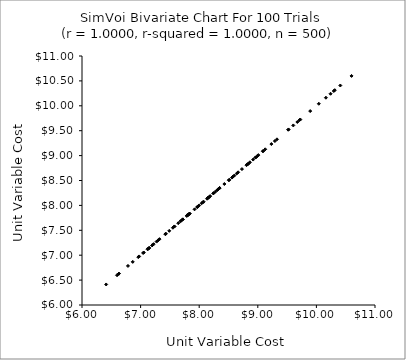
| Category | Series 0 |
|---|---|
| 8.5799233662857 | 8.58 |
| 8.322798937939595 | 8.323 |
| 7.201467640726995 | 7.201 |
| 7.811482448741565 | 7.811 |
| 9.126457782483506 | 9.126 |
| 6.412461766414863 | 6.412 |
| 7.719423426696527 | 7.719 |
| 8.558672436460132 | 8.559 |
| 7.718661596310512 | 7.719 |
| 8.134011712817045 | 8.134 |
| 8.277950662160677 | 8.278 |
| 8.842556173277387 | 8.843 |
| 7.817644752392725 | 7.818 |
| 8.176340179564193 | 8.176 |
| 7.4217532251195735 | 7.422 |
| 6.960760332587584 | 6.961 |
| 7.8313111702073375 | 7.831 |
| 9.71253204860519 | 9.713 |
| 9.009559051875458 | 9.01 |
| 8.429496647251241 | 8.429 |
| 7.8008792750240925 | 7.801 |
| 8.07472128533649 | 8.075 |
| 9.518861166413696 | 9.519 |
| 7.970406837737856 | 7.97 |
| 7.273194652571533 | 7.273 |
| 7.489083048809267 | 7.489 |
| 6.625377284255234 | 6.625 |
| 7.128963195392983 | 7.129 |
| 8.865515044995588 | 8.866 |
| 9.52524895477391 | 9.525 |
| 7.147236327511475 | 7.147 |
| 9.605819153306468 | 9.606 |
| 10.241340660086065 | 10.241 |
| 10.162434953613667 | 10.162 |
| 8.98643888838562 | 8.986 |
| 10.407936328515019 | 10.408 |
| 7.80082965003337 | 7.801 |
| 6.784236433408008 | 6.784 |
| 10.599768073922213 | 10.6 |
| 8.643014296777642 | 8.643 |
| 8.807678212906168 | 8.808 |
| 8.600419279409046 | 8.6 |
| 6.975359096767873 | 6.975 |
| 9.086596772953316 | 9.087 |
| 7.577680843721031 | 7.578 |
| 7.551469433422725 | 7.551 |
| 7.836890463266036 | 7.837 |
| 9.326992812133225 | 9.327 |
| 7.5745251901715385 | 7.575 |
| 7.322483061726135 | 7.322 |
| 8.822264579407284 | 8.822 |
| 7.833156971276349 | 7.833 |
| 9.674772377563313 | 9.675 |
| 8.156055103904192 | 8.156 |
| 8.157255140924462 | 8.157 |
| 9.292115899744925 | 9.292 |
| 9.894085944671128 | 9.894 |
| 8.664326146974176 | 8.664 |
| 8.570173434086822 | 8.57 |
| 7.432071488580894 | 7.432 |
| 10.04098471025165 | 10.041 |
| 7.221376723690576 | 7.221 |
| 8.505475958668336 | 8.505 |
| 7.054271388777496 | 7.054 |
| 8.347905742809601 | 8.348 |
| 7.297879118243739 | 7.298 |
| 8.245654359947244 | 8.246 |
| 8.310356491929902 | 8.31 |
| 7.965956030151336 | 7.966 |
| 8.24025815329633 | 8.24 |
| 7.999096391088855 | 7.999 |
| 6.866053827382114 | 6.866 |
| 8.042941091310917 | 8.043 |
| 7.1412601472951 | 7.141 |
| 9.724901645840218 | 9.725 |
| 10.296987174791745 | 10.297 |
| 8.51369282584637 | 8.514 |
| 9.23186368257091 | 9.232 |
| 7.9795982688006895 | 7.98 |
| 7.642314292760345 | 7.642 |
| 8.962169920184742 | 8.962 |
| 7.0438523837948 | 7.044 |
| 6.597758075026703 | 6.598 |
| 7.920935150421331 | 7.921 |
| 7.679708956540013 | 7.68 |
| 7.196719318290606 | 7.197 |
| 6.63118055024673 | 6.631 |
| 8.348073995229859 | 8.348 |
| 8.82716989691528 | 8.827 |
| 7.69428427379326 | 7.694 |
| 8.920333096546887 | 8.92 |
| 8.18654853860172 | 8.187 |
| 8.14617908735314 | 8.146 |
| 9.092834100716615 | 9.093 |
| 8.963035757919336 | 8.963 |
| 7.118918414560007 | 7.119 |
| 7.787961204840504 | 7.788 |
| 8.729084537025106 | 8.729 |
| 10.313668248811222 | 10.314 |
| 8.062534990859206 | 8.063 |